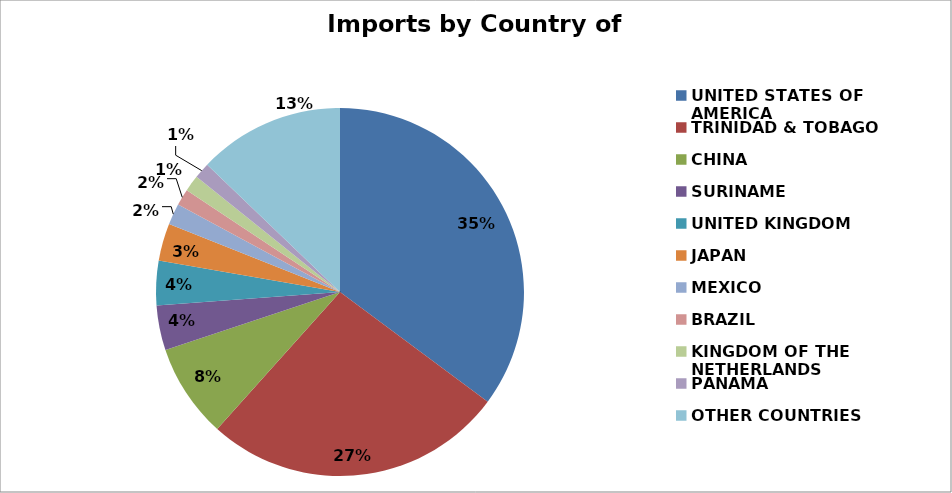
| Category | Series 0 |
|---|---|
| UNITED STATES OF AMERICA | 385050.458 |
| TRINIDAD & TOBAGO | 289709.109 |
| CHINA | 90409.699 |
| SURINAME | 43133.547 |
| UNITED KINGDOM | 42882.766 |
| JAPAN | 36011.832 |
| MEXICO | 20249.742 |
| BRAZIL | 15891.355 |
| KINGDOM OF THE NETHERLANDS | 15714.622 |
| PANAMA | 15275.245 |
| OTHER COUNTRIES | 140566.852 |